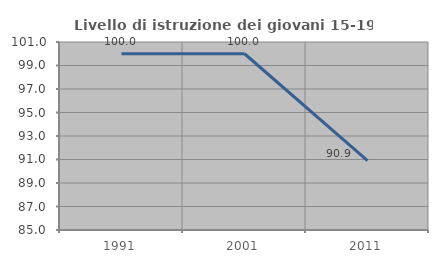
| Category | Livello di istruzione dei giovani 15-19 anni |
|---|---|
| 1991.0 | 100 |
| 2001.0 | 100 |
| 2011.0 | 90.909 |